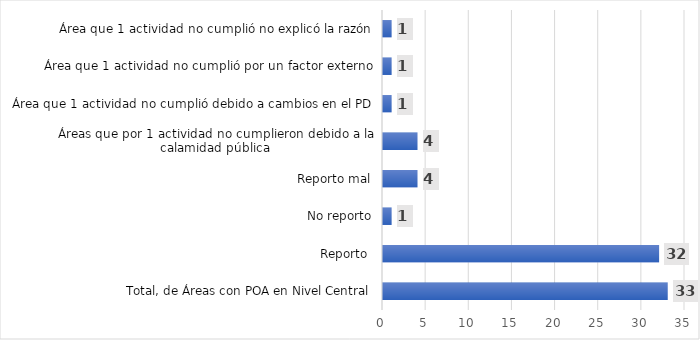
| Category | Series 0 |
|---|---|
| Total, de Áreas con POA en Nivel Central | 33 |
| Reporto  | 32 |
| No reporto | 1 |
| Reporto mal | 4 |
| Áreas que por 1 actividad no cumplieron debido a la calamidad pública | 4 |
| Área que 1 actividad no cumplió debido a cambios en el PD | 1 |
| Área que 1 actividad no cumplió por un factor externo | 1 |
| Área que 1 actividad no cumplió no explicó la razón | 1 |